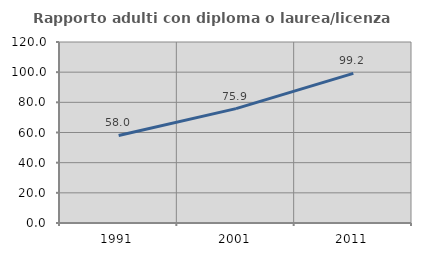
| Category | Rapporto adulti con diploma o laurea/licenza media  |
|---|---|
| 1991.0 | 58.034 |
| 2001.0 | 75.851 |
| 2011.0 | 99.239 |